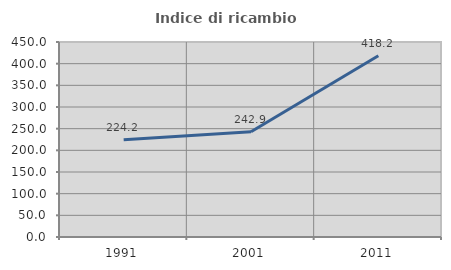
| Category | Indice di ricambio occupazionale  |
|---|---|
| 1991.0 | 224.242 |
| 2001.0 | 242.857 |
| 2011.0 | 418.182 |